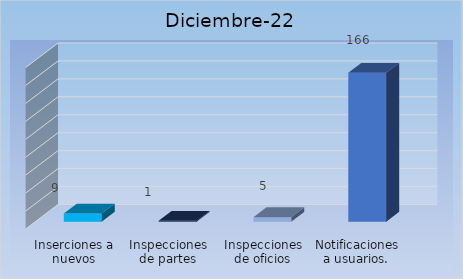
| Category | Cantidad |
|---|---|
| Inserciones a nuevos usuarios | 9 |
| Inspecciones de partes | 1 |
| Inspecciones de oficios | 5 |
| Notificaciones a usuarios.  | 166 |